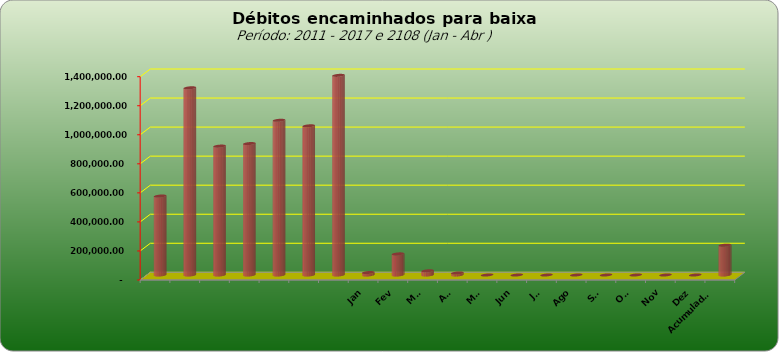
| Category |  543.796,20  |
|---|---|
|  | 543796.2 |
|  | 1289053.69 |
|  | 887573.08 |
|  | 905052.31 |
|  | 1065434.28 |
|  | 1027209.41 |
|  | 1374800.36 |
| Jan | 17005.62 |
| Fev | 145413 |
| Mar | 28943.58 |
| Abr | 13957.8 |
| Mai | 0 |
| Jun | 0 |
| Jul | 0 |
| Ago | 0 |
| Set | 0 |
| Out | 0 |
| Nov | 0 |
| Dez | 0 |
| Acumulado
2016 | 205320 |